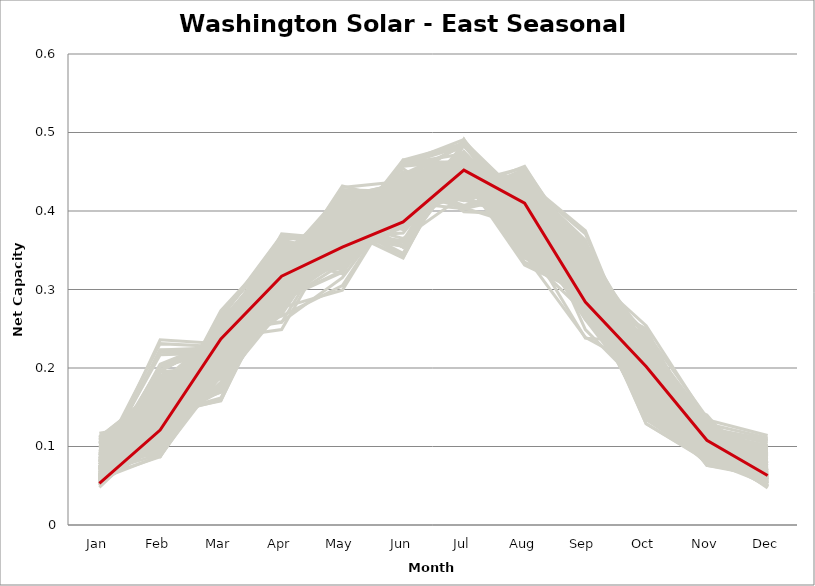
| Category | sample_001 | sample_002 | sample_003 | sample_004 | sample_005 | sample_006 | sample_007 | sample_008 | sample_009 | sample_010 | sample_011 | sample_012 | sample_013 | sample_014 | sample_015 | sample_016 | sample_017 | sample_018 | sample_019 | sample_020 | sample_021 | sample_022 | sample_023 | sample_024 | sample_025 | sample_026 | sample_027 | sample_028 | sample_029 | sample_030 | sample_031 | sample_032 | sample_033 | sample_034 | sample_035 | sample_036 | sample_037 | sample_038 | sample_039 | sample_040 | sample_041 | sample_042 | sample_043 | sample_044 | sample_045 | sample_046 | sample_047 | sample_048 | sample_049 | sample_050 | sample_051 | sample_052 | sample_053 | sample_054 | sample_055 | sample_056 | sample_057 | sample_058 | sample_059 | sample_060 | sample_061 | sample_062 | sample_063 | sample_064 | sample_065 | sample_066 | sample_067 | sample_068 | sample_069 | sample_070 | sample_071 | sample_072 | sample_073 | sample_074 | sample_075 | sample_076 | sample_077 | sample_078 | sample_079 | sample_080 | sample_081 | sample_082 | sample_083 | sample_084 | sample_085 | sample_086 | sample_087 | sample_088 | sample_089 | sample_090 | sample_091 | sample_093 | sample_094 | sample_095 | sample_096 | sample_097 | sample_098 | sample_099 | sample_100 | sample_101 | sample_102 | sample_103 | sample_104 | sample_105 | sample_106 | sample_107 | sample_108 | sample_109 | sample_110 | sample_111 | sample_112 | sample_113 | sample_114 | sample_115 | sample_116 | sample_117 | sample_118 | sample_119 | sample_120 | sample_121 | sample_122 | sample_123 | sample_124 | sample_125 | sample_126 | sample_127 | sample_128 | sample_129 | sample_130 | sample_131 | sample_132 | sample_133 | sample_134 | sample_135 | sample_136 | sample_137 | sample_138 | sample_139 | sample_140 | sample_141 | sample_142 | sample_143 | sample_144 | sample_145 | sample_146 | sample_147 | sample_148 | sample_149 | sample_150 | sample_151 | sample_152 | sample_153 | sample_154 | sample_155 | sample_156 | sample_157 | sample_158 | sample_159 | sample_160 | sample_161 | sample_162 | sample_163 | sample_164 | sample_165 | sample_166 | sample_167 | sample_168 | sample_169 | sample_170 | sample_171 | sample_172 | sample_173 | sample_174 | sample_175 | sample_176 | sample_177 | sample_178 | sample_179 | sample_180 | sample_181 | sample_182 | sample_183 | sample_184 | sample_185 | sample_186 | sample_187 | sample_188 | sample_189 | sample_190 | sample_191 | sample_192 | sample_193 | sample_194 | sample_195 | sample_196 | sample_197 | sample_198 | sample_199 | sample_200 | sample_201 | sample_202 | sample_203 | sample_204 | sample_205 | sample_206 | sample_207 | sample_208 | sample_209 | sample_210 | sample_211 | sample_212 | sample_213 | sample_214 | sample_215 | sample_216 | sample_217 | sample_218 | sample_219 | sample_220 | sample_221 | sample_222 | sample_223 | sample_224 | sample_225 | sample_226 | sample_227 | sample_228 | sample_229 | sample_230 | sample_231 | sample_232 | sample_233 | sample_234 | sample_235 | sample_236 | sample_237 | sample_238 | sample_239 | sample_240 | sample_241 | sample_242 | sample_243 | sample_244 | sample_245 | sample_246 | sample_247 | sample_248 | sample_249 | sample_250 | sample_092 |
|---|---|---|---|---|---|---|---|---|---|---|---|---|---|---|---|---|---|---|---|---|---|---|---|---|---|---|---|---|---|---|---|---|---|---|---|---|---|---|---|---|---|---|---|---|---|---|---|---|---|---|---|---|---|---|---|---|---|---|---|---|---|---|---|---|---|---|---|---|---|---|---|---|---|---|---|---|---|---|---|---|---|---|---|---|---|---|---|---|---|---|---|---|---|---|---|---|---|---|---|---|---|---|---|---|---|---|---|---|---|---|---|---|---|---|---|---|---|---|---|---|---|---|---|---|---|---|---|---|---|---|---|---|---|---|---|---|---|---|---|---|---|---|---|---|---|---|---|---|---|---|---|---|---|---|---|---|---|---|---|---|---|---|---|---|---|---|---|---|---|---|---|---|---|---|---|---|---|---|---|---|---|---|---|---|---|---|---|---|---|---|---|---|---|---|---|---|---|---|---|---|---|---|---|---|---|---|---|---|---|---|---|---|---|---|---|---|---|---|---|---|---|---|---|---|---|---|---|---|---|---|---|---|---|---|---|---|---|---|---|---|---|---|---|---|---|---|---|---|---|---|
| Jan | 0.062 | 0.07 | 0.074 | 0.117 | 0.109 | 0.089 | 0.053 | 0.085 | 0.11 | 0.053 | 0.067 | 0.056 | 0.099 | 0.08 | 0.089 | 0.057 | 0.088 | 0.113 | 0.083 | 0.061 | 0.062 | 0.054 | 0.056 | 0.087 | 0.091 | 0.061 | 0.084 | 0.11 | 0.061 | 0.066 | 0.055 | 0.084 | 0.067 | 0.078 | 0.066 | 0.057 | 0.055 | 0.061 | 0.06 | 0.096 | 0.088 | 0.106 | 0.111 | 0.071 | 0.075 | 0.055 | 0.092 | 0.088 | 0.058 | 0.068 | 0.053 | 0.056 | 0.108 | 0.11 | 0.07 | 0.099 | 0.092 | 0.063 | 0.107 | 0.082 | 0.077 | 0.061 | 0.056 | 0.057 | 0.091 | 0.072 | 0.053 | 0.073 | 0.064 | 0.111 | 0.082 | 0.089 | 0.084 | 0.064 | 0.068 | 0.071 | 0.055 | 0.107 | 0.108 | 0.053 | 0.094 | 0.098 | 0.112 | 0.093 | 0.1 | 0.109 | 0.055 | 0.113 | 0.087 | 0.085 | 0.081 | 0.06 | 0.052 | 0.108 | 0.063 | 0.089 | 0.069 | 0.112 | 0.064 | 0.05 | 0.093 | 0.059 | 0.082 | 0.083 | 0.082 | 0.055 | 0.067 | 0.064 | 0.096 | 0.08 | 0.088 | 0.088 | 0.09 | 0.105 | 0.053 | 0.082 | 0.08 | 0.092 | 0.072 | 0.064 | 0.063 | 0.081 | 0.066 | 0.055 | 0.053 | 0.104 | 0.061 | 0.088 | 0.091 | 0.093 | 0.053 | 0.093 | 0.094 | 0.082 | 0.084 | 0.054 | 0.085 | 0.054 | 0.09 | 0.062 | 0.057 | 0.089 | 0.099 | 0.097 | 0.071 | 0.091 | 0.081 | 0.074 | 0.058 | 0.06 | 0.048 | 0.072 | 0.061 | 0.098 | 0.093 | 0.08 | 0.108 | 0.089 | 0.08 | 0.061 | 0.094 | 0.102 | 0.104 | 0.099 | 0.061 | 0.103 | 0.059 | 0.059 | 0.091 | 0.062 | 0.065 | 0.063 | 0.1 | 0.062 | 0.069 | 0.077 | 0.073 | 0.065 | 0.063 | 0.052 | 0.058 | 0.066 | 0.075 | 0.07 | 0.077 | 0.095 | 0.106 | 0.086 | 0.105 | 0.085 | 0.09 | 0.059 | 0.072 | 0.074 | 0.052 | 0.077 | 0.055 | 0.061 | 0.065 | 0.053 | 0.086 | 0.098 | 0.085 | 0.071 | 0.099 | 0.079 | 0.102 | 0.098 | 0.107 | 0.107 | 0.064 | 0.087 | 0.059 | 0.084 | 0.058 | 0.08 | 0.074 | 0.058 | 0.091 | 0.084 | 0.105 | 0.059 | 0.083 | 0.103 | 0.103 | 0.078 | 0.082 | 0.107 | 0.088 | 0.098 | 0.051 | 0.052 | 0.058 | 0.08 | 0.084 | 0.09 | 0.112 | 0.052 | 0.088 | 0.09 | 0.077 | 0.077 | 0.083 | 0.067 | 0.058 | 0.087 | 0.089 | 0.071 | 0.067 | 0.053 |
| Feb | 0.119 | 0.142 | 0.171 | 0.13 | 0.174 | 0.138 | 0.116 | 0.111 | 0.128 | 0.155 | 0.15 | 0.116 | 0.118 | 0.174 | 0.096 | 0.152 | 0.132 | 0.13 | 0.097 | 0.163 | 0.111 | 0.113 | 0.155 | 0.095 | 0.087 | 0.161 | 0.122 | 0.142 | 0.158 | 0.158 | 0.109 | 0.126 | 0.09 | 0.112 | 0.131 | 0.115 | 0.137 | 0.154 | 0.149 | 0.122 | 0.133 | 0.14 | 0.117 | 0.223 | 0.168 | 0.107 | 0.098 | 0.111 | 0.186 | 0.122 | 0.116 | 0.109 | 0.139 | 0.152 | 0.202 | 0.112 | 0.109 | 0.144 | 0.132 | 0.108 | 0.133 | 0.197 | 0.124 | 0.149 | 0.149 | 0.121 | 0.15 | 0.223 | 0.205 | 0.165 | 0.121 | 0.165 | 0.134 | 0.195 | 0.12 | 0.16 | 0.186 | 0.141 | 0.122 | 0.106 | 0.094 | 0.135 | 0.128 | 0.103 | 0.143 | 0.137 | 0.176 | 0.123 | 0.107 | 0.14 | 0.12 | 0.142 | 0.128 | 0.157 | 0.147 | 0.092 | 0.18 | 0.173 | 0.122 | 0.148 | 0.151 | 0.166 | 0.141 | 0.128 | 0.128 | 0.104 | 0.127 | 0.097 | 0.116 | 0.162 | 0.096 | 0.118 | 0.097 | 0.127 | 0.114 | 0.116 | 0.127 | 0.136 | 0.122 | 0.155 | 0.14 | 0.231 | 0.134 | 0.129 | 0.14 | 0.15 | 0.126 | 0.126 | 0.12 | 0.101 | 0.182 | 0.134 | 0.087 | 0.132 | 0.13 | 0.112 | 0.11 | 0.103 | 0.117 | 0.128 | 0.148 | 0.139 | 0.108 | 0.116 | 0.094 | 0.135 | 0.108 | 0.181 | 0.088 | 0.149 | 0.122 | 0.178 | 0.164 | 0.096 | 0.148 | 0.128 | 0.141 | 0.142 | 0.151 | 0.196 | 0.124 | 0.119 | 0.162 | 0.136 | 0.152 | 0.139 | 0.157 | 0.143 | 0.106 | 0.188 | 0.12 | 0.11 | 0.141 | 0.109 | 0.191 | 0.139 | 0.16 | 0.116 | 0.126 | 0.125 | 0.113 | 0.129 | 0.118 | 0.105 | 0.123 | 0.142 | 0.131 | 0.141 | 0.139 | 0.132 | 0.128 | 0.149 | 0.105 | 0.202 | 0.136 | 0.217 | 0.147 | 0.087 | 0.102 | 0.107 | 0.144 | 0.136 | 0.14 | 0.236 | 0.146 | 0.111 | 0.135 | 0.089 | 0.125 | 0.125 | 0.129 | 0.147 | 0.112 | 0.142 | 0.159 | 0.128 | 0.132 | 0.109 | 0.155 | 0.18 | 0.181 | 0.197 | 0.14 | 0.177 | 0.148 | 0.118 | 0.137 | 0.162 | 0.153 | 0.162 | 0.169 | 0.183 | 0.156 | 0.122 | 0.127 | 0.135 | 0.172 | 0.108 | 0.107 | 0.104 | 0.115 | 0.22 | 0.139 | 0.183 | 0.105 | 0.09 | 0.134 | 0.133 | 0.161 | 0.121 |
| Mar | 0.238 | 0.265 | 0.236 | 0.225 | 0.254 | 0.193 | 0.237 | 0.229 | 0.21 | 0.189 | 0.229 | 0.236 | 0.219 | 0.241 | 0.222 | 0.247 | 0.189 | 0.247 | 0.223 | 0.212 | 0.254 | 0.238 | 0.252 | 0.201 | 0.197 | 0.223 | 0.176 | 0.214 | 0.255 | 0.233 | 0.224 | 0.218 | 0.238 | 0.213 | 0.268 | 0.234 | 0.247 | 0.253 | 0.247 | 0.25 | 0.172 | 0.228 | 0.221 | 0.222 | 0.232 | 0.232 | 0.222 | 0.238 | 0.206 | 0.259 | 0.237 | 0.245 | 0.209 | 0.251 | 0.221 | 0.248 | 0.237 | 0.206 | 0.215 | 0.206 | 0.246 | 0.236 | 0.242 | 0.205 | 0.237 | 0.191 | 0.19 | 0.226 | 0.236 | 0.249 | 0.212 | 0.239 | 0.177 | 0.203 | 0.239 | 0.235 | 0.188 | 0.229 | 0.208 | 0.218 | 0.196 | 0.221 | 0.235 | 0.228 | 0.208 | 0.216 | 0.193 | 0.237 | 0.202 | 0.207 | 0.18 | 0.243 | 0.251 | 0.244 | 0.201 | 0.212 | 0.2 | 0.251 | 0.256 | 0.194 | 0.209 | 0.228 | 0.209 | 0.173 | 0.172 | 0.227 | 0.273 | 0.246 | 0.235 | 0.209 | 0.223 | 0.243 | 0.238 | 0.237 | 0.252 | 0.204 | 0.171 | 0.206 | 0.192 | 0.238 | 0.26 | 0.227 | 0.263 | 0.245 | 0.25 | 0.238 | 0.247 | 0.211 | 0.211 | 0.225 | 0.192 | 0.213 | 0.203 | 0.176 | 0.195 | 0.242 | 0.182 | 0.229 | 0.209 | 0.271 | 0.241 | 0.159 | 0.224 | 0.217 | 0.223 | 0.173 | 0.197 | 0.23 | 0.227 | 0.252 | 0.243 | 0.232 | 0.227 | 0.194 | 0.214 | 0.223 | 0.234 | 0.169 | 0.204 | 0.237 | 0.255 | 0.214 | 0.256 | 0.215 | 0.258 | 0.217 | 0.254 | 0.248 | 0.215 | 0.209 | 0.254 | 0.251 | 0.214 | 0.222 | 0.209 | 0.187 | 0.238 | 0.25 | 0.251 | 0.251 | 0.237 | 0.268 | 0.195 | 0.253 | 0.174 | 0.217 | 0.236 | 0.171 | 0.218 | 0.188 | 0.207 | 0.209 | 0.18 | 0.233 | 0.253 | 0.219 | 0.248 | 0.236 | 0.236 | 0.236 | 0.245 | 0.211 | 0.191 | 0.231 | 0.233 | 0.197 | 0.241 | 0.19 | 0.21 | 0.232 | 0.267 | 0.198 | 0.25 | 0.158 | 0.25 | 0.214 | 0.238 | 0.238 | 0.212 | 0.23 | 0.247 | 0.235 | 0.162 | 0.247 | 0.242 | 0.19 | 0.179 | 0.249 | 0.203 | 0.207 | 0.191 | 0.187 | 0.208 | 0.176 | 0.191 | 0.171 | 0.245 | 0.226 | 0.237 | 0.237 | 0.206 | 0.221 | 0.207 | 0.21 | 0.226 | 0.213 | 0.17 | 0.267 | 0.231 | 0.237 |
| Apr | 0.338 | 0.369 | 0.339 | 0.327 | 0.354 | 0.335 | 0.313 | 0.317 | 0.335 | 0.297 | 0.316 | 0.325 | 0.343 | 0.367 | 0.317 | 0.345 | 0.287 | 0.316 | 0.328 | 0.305 | 0.333 | 0.3 | 0.342 | 0.32 | 0.308 | 0.287 | 0.309 | 0.346 | 0.343 | 0.322 | 0.326 | 0.283 | 0.249 | 0.344 | 0.356 | 0.327 | 0.326 | 0.336 | 0.277 | 0.329 | 0.308 | 0.355 | 0.336 | 0.287 | 0.335 | 0.307 | 0.327 | 0.31 | 0.311 | 0.35 | 0.295 | 0.318 | 0.33 | 0.344 | 0.291 | 0.328 | 0.314 | 0.292 | 0.345 | 0.268 | 0.29 | 0.285 | 0.322 | 0.278 | 0.331 | 0.319 | 0.295 | 0.281 | 0.288 | 0.344 | 0.329 | 0.364 | 0.304 | 0.311 | 0.352 | 0.326 | 0.304 | 0.36 | 0.331 | 0.314 | 0.324 | 0.336 | 0.326 | 0.316 | 0.328 | 0.35 | 0.29 | 0.324 | 0.344 | 0.313 | 0.275 | 0.331 | 0.326 | 0.347 | 0.287 | 0.319 | 0.31 | 0.363 | 0.35 | 0.292 | 0.348 | 0.314 | 0.295 | 0.292 | 0.294 | 0.302 | 0.357 | 0.258 | 0.325 | 0.316 | 0.321 | 0.322 | 0.313 | 0.323 | 0.339 | 0.27 | 0.291 | 0.294 | 0.333 | 0.322 | 0.348 | 0.29 | 0.368 | 0.319 | 0.34 | 0.361 | 0.35 | 0.328 | 0.338 | 0.322 | 0.299 | 0.357 | 0.311 | 0.304 | 0.341 | 0.309 | 0.329 | 0.302 | 0.325 | 0.351 | 0.266 | 0.314 | 0.32 | 0.343 | 0.272 | 0.322 | 0.334 | 0.366 | 0.295 | 0.331 | 0.318 | 0.35 | 0.287 | 0.319 | 0.353 | 0.334 | 0.355 | 0.33 | 0.342 | 0.28 | 0.325 | 0.346 | 0.347 | 0.322 | 0.341 | 0.318 | 0.33 | 0.335 | 0.318 | 0.305 | 0.351 | 0.331 | 0.326 | 0.307 | 0.313 | 0.334 | 0.341 | 0.345 | 0.353 | 0.317 | 0.333 | 0.359 | 0.33 | 0.332 | 0.287 | 0.317 | 0.319 | 0.312 | 0.335 | 0.282 | 0.301 | 0.302 | 0.322 | 0.292 | 0.322 | 0.289 | 0.341 | 0.294 | 0.315 | 0.336 | 0.302 | 0.323 | 0.334 | 0.295 | 0.354 | 0.325 | 0.318 | 0.319 | 0.332 | 0.328 | 0.358 | 0.32 | 0.33 | 0.324 | 0.259 | 0.282 | 0.288 | 0.3 | 0.322 | 0.371 | 0.36 | 0.283 | 0.315 | 0.345 | 0.352 | 0.323 | 0.335 | 0.335 | 0.327 | 0.353 | 0.285 | 0.302 | 0.28 | 0.29 | 0.289 | 0.301 | 0.353 | 0.328 | 0.318 | 0.312 | 0.338 | 0.293 | 0.309 | 0.314 | 0.302 | 0.318 | 0.31 | 0.355 | 0.321 | 0.317 |
| May | 0.358 | 0.354 | 0.37 | 0.419 | 0.355 | 0.371 | 0.346 | 0.418 | 0.368 | 0.345 | 0.392 | 0.348 | 0.412 | 0.366 | 0.407 | 0.329 | 0.404 | 0.43 | 0.397 | 0.383 | 0.358 | 0.361 | 0.32 | 0.38 | 0.383 | 0.324 | 0.375 | 0.347 | 0.328 | 0.39 | 0.375 | 0.386 | 0.383 | 0.373 | 0.359 | 0.355 | 0.333 | 0.332 | 0.299 | 0.413 | 0.371 | 0.353 | 0.423 | 0.381 | 0.384 | 0.362 | 0.404 | 0.427 | 0.339 | 0.359 | 0.367 | 0.363 | 0.373 | 0.353 | 0.358 | 0.417 | 0.432 | 0.406 | 0.365 | 0.385 | 0.4 | 0.34 | 0.354 | 0.408 | 0.375 | 0.369 | 0.335 | 0.378 | 0.342 | 0.348 | 0.407 | 0.368 | 0.375 | 0.354 | 0.357 | 0.391 | 0.335 | 0.352 | 0.375 | 0.378 | 0.393 | 0.369 | 0.408 | 0.422 | 0.367 | 0.359 | 0.347 | 0.422 | 0.378 | 0.38 | 0.373 | 0.34 | 0.34 | 0.355 | 0.396 | 0.397 | 0.36 | 0.346 | 0.353 | 0.337 | 0.37 | 0.39 | 0.383 | 0.366 | 0.369 | 0.368 | 0.36 | 0.385 | 0.415 | 0.386 | 0.408 | 0.408 | 0.424 | 0.419 | 0.353 | 0.381 | 0.366 | 0.399 | 0.37 | 0.385 | 0.35 | 0.38 | 0.351 | 0.356 | 0.325 | 0.338 | 0.349 | 0.402 | 0.397 | 0.397 | 0.344 | 0.365 | 0.388 | 0.37 | 0.377 | 0.357 | 0.38 | 0.371 | 0.393 | 0.358 | 0.305 | 0.369 | 0.42 | 0.409 | 0.388 | 0.372 | 0.375 | 0.371 | 0.379 | 0.338 | 0.341 | 0.37 | 0.322 | 0.396 | 0.371 | 0.358 | 0.339 | 0.372 | 0.37 | 0.352 | 0.415 | 0.405 | 0.339 | 0.38 | 0.32 | 0.384 | 0.33 | 0.342 | 0.401 | 0.351 | 0.358 | 0.361 | 0.38 | 0.358 | 0.366 | 0.359 | 0.372 | 0.355 | 0.35 | 0.345 | 0.358 | 0.357 | 0.374 | 0.406 | 0.373 | 0.383 | 0.413 | 0.369 | 0.358 | 0.404 | 0.396 | 0.394 | 0.38 | 0.367 | 0.343 | 0.369 | 0.33 | 0.377 | 0.385 | 0.358 | 0.401 | 0.382 | 0.373 | 0.375 | 0.34 | 0.369 | 0.407 | 0.385 | 0.369 | 0.418 | 0.348 | 0.386 | 0.359 | 0.366 | 0.315 | 0.392 | 0.402 | 0.373 | 0.379 | 0.364 | 0.345 | 0.333 | 0.366 | 0.341 | 0.343 | 0.367 | 0.356 | 0.351 | 0.393 | 0.364 | 0.352 | 0.336 | 0.396 | 0.366 | 0.398 | 0.371 | 0.352 | 0.364 | 0.419 | 0.423 | 0.371 | 0.382 | 0.378 | 0.371 | 0.372 | 0.394 | 0.362 | 0.359 | 0.387 | 0.354 |
| Jun | 0.416 | 0.433 | 0.44 | 0.431 | 0.413 | 0.418 | 0.387 | 0.426 | 0.386 | 0.442 | 0.41 | 0.379 | 0.406 | 0.44 | 0.416 | 0.429 | 0.354 | 0.438 | 0.425 | 0.431 | 0.426 | 0.38 | 0.449 | 0.442 | 0.433 | 0.417 | 0.422 | 0.425 | 0.44 | 0.425 | 0.394 | 0.389 | 0.411 | 0.405 | 0.424 | 0.385 | 0.425 | 0.437 | 0.425 | 0.429 | 0.416 | 0.429 | 0.413 | 0.425 | 0.439 | 0.392 | 0.412 | 0.425 | 0.46 | 0.426 | 0.372 | 0.387 | 0.412 | 0.415 | 0.424 | 0.43 | 0.412 | 0.415 | 0.41 | 0.365 | 0.401 | 0.437 | 0.399 | 0.398 | 0.36 | 0.395 | 0.433 | 0.42 | 0.429 | 0.418 | 0.408 | 0.379 | 0.417 | 0.463 | 0.424 | 0.418 | 0.461 | 0.419 | 0.388 | 0.396 | 0.436 | 0.402 | 0.425 | 0.416 | 0.415 | 0.413 | 0.461 | 0.429 | 0.383 | 0.395 | 0.4 | 0.416 | 0.409 | 0.419 | 0.401 | 0.426 | 0.46 | 0.423 | 0.43 | 0.441 | 0.414 | 0.435 | 0.392 | 0.413 | 0.418 | 0.355 | 0.43 | 0.408 | 0.421 | 0.346 | 0.415 | 0.435 | 0.42 | 0.435 | 0.427 | 0.379 | 0.422 | 0.38 | 0.393 | 0.419 | 0.431 | 0.426 | 0.436 | 0.388 | 0.431 | 0.437 | 0.434 | 0.403 | 0.403 | 0.41 | 0.459 | 0.408 | 0.429 | 0.423 | 0.416 | 0.388 | 0.413 | 0.394 | 0.382 | 0.435 | 0.422 | 0.41 | 0.414 | 0.412 | 0.454 | 0.407 | 0.39 | 0.443 | 0.341 | 0.436 | 0.401 | 0.446 | 0.415 | 0.432 | 0.41 | 0.446 | 0.432 | 0.423 | 0.45 | 0.431 | 0.427 | 0.413 | 0.432 | 0.405 | 0.447 | 0.401 | 0.433 | 0.422 | 0.421 | 0.457 | 0.427 | 0.42 | 0.388 | 0.398 | 0.465 | 0.434 | 0.437 | 0.423 | 0.435 | 0.406 | 0.42 | 0.437 | 0.384 | 0.42 | 0.404 | 0.394 | 0.43 | 0.421 | 0.428 | 0.376 | 0.356 | 0.421 | 0.387 | 0.425 | 0.408 | 0.427 | 0.433 | 0.34 | 0.426 | 0.424 | 0.398 | 0.401 | 0.426 | 0.436 | 0.425 | 0.387 | 0.433 | 0.43 | 0.386 | 0.436 | 0.436 | 0.343 | 0.428 | 0.417 | 0.418 | 0.39 | 0.394 | 0.362 | 0.356 | 0.446 | 0.424 | 0.439 | 0.418 | 0.423 | 0.429 | 0.389 | 0.427 | 0.431 | 0.354 | 0.415 | 0.447 | 0.465 | 0.417 | 0.415 | 0.354 | 0.407 | 0.415 | 0.404 | 0.423 | 0.423 | 0.401 | 0.424 | 0.392 | 0.461 | 0.355 | 0.427 | 0.398 | 0.429 | 0.413 | 0.386 |
| Jul | 0.451 | 0.443 | 0.46 | 0.446 | 0.468 | 0.424 | 0.461 | 0.434 | 0.452 | 0.485 | 0.461 | 0.444 | 0.447 | 0.457 | 0.419 | 0.455 | 0.457 | 0.432 | 0.436 | 0.453 | 0.45 | 0.46 | 0.457 | 0.418 | 0.419 | 0.451 | 0.432 | 0.45 | 0.452 | 0.462 | 0.455 | 0.438 | 0.403 | 0.467 | 0.451 | 0.454 | 0.458 | 0.452 | 0.44 | 0.424 | 0.43 | 0.442 | 0.447 | 0.455 | 0.459 | 0.461 | 0.427 | 0.436 | 0.473 | 0.453 | 0.465 | 0.459 | 0.445 | 0.46 | 0.45 | 0.424 | 0.433 | 0.45 | 0.452 | 0.42 | 0.419 | 0.458 | 0.451 | 0.451 | 0.462 | 0.485 | 0.489 | 0.459 | 0.463 | 0.462 | 0.458 | 0.457 | 0.439 | 0.462 | 0.456 | 0.466 | 0.491 | 0.444 | 0.452 | 0.452 | 0.407 | 0.449 | 0.451 | 0.43 | 0.45 | 0.447 | 0.485 | 0.446 | 0.471 | 0.454 | 0.427 | 0.461 | 0.463 | 0.457 | 0.452 | 0.423 | 0.459 | 0.467 | 0.457 | 0.485 | 0.459 | 0.45 | 0.449 | 0.42 | 0.42 | 0.488 | 0.443 | 0.422 | 0.428 | 0.491 | 0.43 | 0.436 | 0.432 | 0.452 | 0.452 | 0.431 | 0.418 | 0.434 | 0.471 | 0.463 | 0.459 | 0.454 | 0.442 | 0.456 | 0.457 | 0.456 | 0.456 | 0.467 | 0.463 | 0.426 | 0.483 | 0.456 | 0.413 | 0.428 | 0.458 | 0.458 | 0.436 | 0.445 | 0.453 | 0.449 | 0.446 | 0.447 | 0.43 | 0.457 | 0.399 | 0.434 | 0.467 | 0.462 | 0.486 | 0.456 | 0.46 | 0.453 | 0.446 | 0.416 | 0.447 | 0.418 | 0.44 | 0.437 | 0.436 | 0.449 | 0.425 | 0.446 | 0.467 | 0.45 | 0.455 | 0.443 | 0.457 | 0.458 | 0.421 | 0.464 | 0.456 | 0.451 | 0.444 | 0.444 | 0.447 | 0.447 | 0.462 | 0.448 | 0.462 | 0.458 | 0.447 | 0.445 | 0.474 | 0.414 | 0.435 | 0.45 | 0.458 | 0.44 | 0.45 | 0.448 | 0.462 | 0.449 | 0.439 | 0.453 | 0.466 | 0.452 | 0.456 | 0.485 | 0.404 | 0.456 | 0.425 | 0.447 | 0.439 | 0.454 | 0.446 | 0.473 | 0.458 | 0.405 | 0.452 | 0.453 | 0.452 | 0.475 | 0.45 | 0.441 | 0.447 | 0.445 | 0.427 | 0.486 | 0.468 | 0.464 | 0.467 | 0.465 | 0.437 | 0.473 | 0.454 | 0.476 | 0.44 | 0.463 | 0.491 | 0.441 | 0.483 | 0.486 | 0.454 | 0.421 | 0.455 | 0.43 | 0.466 | 0.452 | 0.439 | 0.438 | 0.466 | 0.459 | 0.455 | 0.452 | 0.484 | 0.42 | 0.418 | 0.446 | 0.462 | 0.452 |
| Aug | 0.44 | 0.342 | 0.414 | 0.361 | 0.361 | 0.423 | 0.414 | 0.421 | 0.39 | 0.402 | 0.418 | 0.407 | 0.378 | 0.4 | 0.426 | 0.383 | 0.376 | 0.362 | 0.419 | 0.421 | 0.354 | 0.416 | 0.386 | 0.429 | 0.436 | 0.435 | 0.446 | 0.38 | 0.381 | 0.415 | 0.364 | 0.426 | 0.42 | 0.398 | 0.345 | 0.408 | 0.397 | 0.383 | 0.441 | 0.403 | 0.441 | 0.379 | 0.376 | 0.406 | 0.42 | 0.422 | 0.422 | 0.415 | 0.403 | 0.332 | 0.422 | 0.411 | 0.415 | 0.365 | 0.418 | 0.41 | 0.418 | 0.43 | 0.387 | 0.437 | 0.42 | 0.422 | 0.4 | 0.434 | 0.366 | 0.402 | 0.414 | 0.405 | 0.425 | 0.361 | 0.383 | 0.344 | 0.443 | 0.406 | 0.347 | 0.414 | 0.396 | 0.374 | 0.388 | 0.372 | 0.429 | 0.385 | 0.359 | 0.419 | 0.421 | 0.373 | 0.396 | 0.361 | 0.396 | 0.425 | 0.457 | 0.398 | 0.395 | 0.366 | 0.43 | 0.427 | 0.412 | 0.351 | 0.347 | 0.406 | 0.387 | 0.416 | 0.43 | 0.45 | 0.452 | 0.412 | 0.331 | 0.415 | 0.411 | 0.36 | 0.423 | 0.401 | 0.419 | 0.355 | 0.346 | 0.439 | 0.449 | 0.423 | 0.403 | 0.412 | 0.348 | 0.403 | 0.354 | 0.393 | 0.384 | 0.376 | 0.342 | 0.377 | 0.386 | 0.418 | 0.394 | 0.373 | 0.435 | 0.443 | 0.406 | 0.419 | 0.421 | 0.371 | 0.385 | 0.344 | 0.442 | 0.439 | 0.417 | 0.38 | 0.396 | 0.431 | 0.401 | 0.407 | 0.412 | 0.389 | 0.418 | 0.405 | 0.439 | 0.433 | 0.384 | 0.389 | 0.372 | 0.43 | 0.42 | 0.436 | 0.408 | 0.375 | 0.367 | 0.417 | 0.389 | 0.419 | 0.391 | 0.381 | 0.427 | 0.408 | 0.34 | 0.35 | 0.4 | 0.383 | 0.412 | 0.429 | 0.401 | 0.343 | 0.351 | 0.391 | 0.357 | 0.341 | 0.398 | 0.391 | 0.455 | 0.417 | 0.351 | 0.437 | 0.42 | 0.389 | 0.358 | 0.429 | 0.421 | 0.419 | 0.394 | 0.411 | 0.385 | 0.412 | 0.38 | 0.351 | 0.415 | 0.421 | 0.422 | 0.402 | 0.371 | 0.401 | 0.364 | 0.43 | 0.381 | 0.361 | 0.335 | 0.349 | 0.351 | 0.437 | 0.442 | 0.437 | 0.419 | 0.407 | 0.345 | 0.395 | 0.359 | 0.43 | 0.44 | 0.365 | 0.37 | 0.396 | 0.428 | 0.369 | 0.348 | 0.392 | 0.396 | 0.401 | 0.432 | 0.453 | 0.38 | 0.44 | 0.366 | 0.351 | 0.413 | 0.412 | 0.397 | 0.409 | 0.426 | 0.41 | 0.411 | 0.427 | 0.432 | 0.348 | 0.415 | 0.41 |
| Sep | 0.284 | 0.287 | 0.3 | 0.302 | 0.295 | 0.273 | 0.272 | 0.318 | 0.357 | 0.331 | 0.327 | 0.275 | 0.312 | 0.282 | 0.336 | 0.269 | 0.322 | 0.315 | 0.334 | 0.32 | 0.313 | 0.278 | 0.262 | 0.36 | 0.356 | 0.348 | 0.319 | 0.341 | 0.266 | 0.32 | 0.313 | 0.36 | 0.356 | 0.315 | 0.3 | 0.277 | 0.278 | 0.268 | 0.348 | 0.284 | 0.311 | 0.341 | 0.304 | 0.284 | 0.314 | 0.282 | 0.335 | 0.299 | 0.302 | 0.294 | 0.276 | 0.268 | 0.304 | 0.306 | 0.304 | 0.295 | 0.299 | 0.329 | 0.35 | 0.371 | 0.31 | 0.307 | 0.292 | 0.329 | 0.238 | 0.32 | 0.334 | 0.293 | 0.31 | 0.3 | 0.319 | 0.239 | 0.322 | 0.286 | 0.3 | 0.314 | 0.308 | 0.343 | 0.355 | 0.318 | 0.353 | 0.359 | 0.311 | 0.315 | 0.306 | 0.345 | 0.313 | 0.308 | 0.324 | 0.333 | 0.336 | 0.28 | 0.299 | 0.319 | 0.331 | 0.348 | 0.301 | 0.285 | 0.302 | 0.332 | 0.287 | 0.317 | 0.354 | 0.334 | 0.333 | 0.295 | 0.294 | 0.349 | 0.297 | 0.278 | 0.341 | 0.297 | 0.308 | 0.308 | 0.306 | 0.375 | 0.334 | 0.359 | 0.317 | 0.316 | 0.296 | 0.287 | 0.278 | 0.294 | 0.273 | 0.341 | 0.305 | 0.321 | 0.33 | 0.334 | 0.311 | 0.297 | 0.355 | 0.322 | 0.304 | 0.279 | 0.324 | 0.306 | 0.327 | 0.298 | 0.346 | 0.31 | 0.313 | 0.316 | 0.354 | 0.309 | 0.324 | 0.286 | 0.283 | 0.269 | 0.29 | 0.306 | 0.346 | 0.355 | 0.282 | 0.291 | 0.349 | 0.304 | 0.249 | 0.3 | 0.277 | 0.319 | 0.311 | 0.316 | 0.277 | 0.316 | 0.266 | 0.262 | 0.34 | 0.294 | 0.306 | 0.313 | 0.311 | 0.294 | 0.286 | 0.301 | 0.301 | 0.307 | 0.3 | 0.293 | 0.314 | 0.291 | 0.323 | 0.308 | 0.343 | 0.315 | 0.296 | 0.313 | 0.302 | 0.337 | 0.31 | 0.329 | 0.324 | 0.294 | 0.291 | 0.293 | 0.272 | 0.285 | 0.306 | 0.32 | 0.312 | 0.315 | 0.275 | 0.273 | 0.345 | 0.324 | 0.312 | 0.359 | 0.358 | 0.3 | 0.299 | 0.289 | 0.307 | 0.313 | 0.347 | 0.363 | 0.314 | 0.273 | 0.27 | 0.275 | 0.287 | 0.312 | 0.319 | 0.301 | 0.327 | 0.326 | 0.289 | 0.31 | 0.282 | 0.283 | 0.323 | 0.312 | 0.346 | 0.343 | 0.327 | 0.31 | 0.297 | 0.32 | 0.309 | 0.305 | 0.314 | 0.295 | 0.349 | 0.285 | 0.281 | 0.348 | 0.309 | 0.296 | 0.315 | 0.284 |
| Oct | 0.192 | 0.15 | 0.194 | 0.154 | 0.177 | 0.166 | 0.211 | 0.177 | 0.21 | 0.181 | 0.22 | 0.196 | 0.155 | 0.198 | 0.166 | 0.176 | 0.213 | 0.141 | 0.173 | 0.227 | 0.199 | 0.217 | 0.161 | 0.173 | 0.176 | 0.192 | 0.179 | 0.201 | 0.165 | 0.219 | 0.212 | 0.172 | 0.227 | 0.184 | 0.164 | 0.194 | 0.187 | 0.166 | 0.208 | 0.173 | 0.176 | 0.197 | 0.148 | 0.142 | 0.197 | 0.214 | 0.166 | 0.183 | 0.156 | 0.175 | 0.216 | 0.211 | 0.138 | 0.185 | 0.165 | 0.179 | 0.175 | 0.232 | 0.211 | 0.19 | 0.175 | 0.182 | 0.194 | 0.243 | 0.233 | 0.205 | 0.183 | 0.158 | 0.176 | 0.172 | 0.168 | 0.197 | 0.172 | 0.139 | 0.178 | 0.21 | 0.149 | 0.192 | 0.214 | 0.217 | 0.165 | 0.218 | 0.148 | 0.186 | 0.129 | 0.201 | 0.156 | 0.143 | 0.187 | 0.148 | 0.17 | 0.183 | 0.183 | 0.178 | 0.24 | 0.172 | 0.14 | 0.173 | 0.187 | 0.194 | 0.25 | 0.219 | 0.158 | 0.171 | 0.18 | 0.232 | 0.165 | 0.218 | 0.165 | 0.23 | 0.174 | 0.181 | 0.183 | 0.153 | 0.199 | 0.186 | 0.172 | 0.155 | 0.201 | 0.216 | 0.167 | 0.146 | 0.155 | 0.18 | 0.179 | 0.184 | 0.195 | 0.171 | 0.167 | 0.164 | 0.159 | 0.249 | 0.173 | 0.173 | 0.237 | 0.209 | 0.245 | 0.228 | 0.16 | 0.173 | 0.2 | 0.183 | 0.173 | 0.163 | 0.2 | 0.158 | 0.195 | 0.187 | 0.236 | 0.178 | 0.201 | 0.205 | 0.194 | 0.159 | 0.242 | 0.203 | 0.199 | 0.162 | 0.171 | 0.186 | 0.179 | 0.161 | 0.185 | 0.141 | 0.164 | 0.144 | 0.171 | 0.173 | 0.158 | 0.153 | 0.19 | 0.197 | 0.145 | 0.234 | 0.138 | 0.171 | 0.202 | 0.184 | 0.185 | 0.186 | 0.19 | 0.168 | 0.207 | 0.156 | 0.181 | 0.143 | 0.154 | 0.172 | 0.129 | 0.213 | 0.221 | 0.231 | 0.254 | 0.176 | 0.181 | 0.145 | 0.186 | 0.236 | 0.187 | 0.207 | 0.166 | 0.134 | 0.172 | 0.154 | 0.195 | 0.189 | 0.157 | 0.167 | 0.221 | 0.164 | 0.171 | 0.215 | 0.201 | 0.165 | 0.195 | 0.175 | 0.174 | 0.216 | 0.229 | 0.179 | 0.184 | 0.186 | 0.168 | 0.179 | 0.182 | 0.211 | 0.169 | 0.179 | 0.22 | 0.229 | 0.16 | 0.153 | 0.238 | 0.174 | 0.219 | 0.177 | 0.171 | 0.211 | 0.181 | 0.181 | 0.19 | 0.148 | 0.152 | 0.143 | 0.237 | 0.178 | 0.169 | 0.155 | 0.21 | 0.202 |
| Nov | 0.094 | 0.102 | 0.082 | 0.101 | 0.091 | 0.108 | 0.105 | 0.104 | 0.105 | 0.108 | 0.091 | 0.103 | 0.102 | 0.084 | 0.11 | 0.086 | 0.127 | 0.104 | 0.114 | 0.102 | 0.126 | 0.103 | 0.091 | 0.131 | 0.138 | 0.105 | 0.118 | 0.095 | 0.09 | 0.087 | 0.127 | 0.082 | 0.1 | 0.106 | 0.108 | 0.105 | 0.093 | 0.089 | 0.102 | 0.076 | 0.119 | 0.091 | 0.099 | 0.1 | 0.085 | 0.106 | 0.111 | 0.097 | 0.088 | 0.116 | 0.103 | 0.101 | 0.082 | 0.094 | 0.104 | 0.078 | 0.092 | 0.113 | 0.095 | 0.081 | 0.089 | 0.102 | 0.103 | 0.12 | 0.104 | 0.11 | 0.113 | 0.102 | 0.1 | 0.092 | 0.112 | 0.102 | 0.113 | 0.087 | 0.117 | 0.086 | 0.089 | 0.09 | 0.107 | 0.132 | 0.121 | 0.107 | 0.1 | 0.107 | 0.082 | 0.097 | 0.096 | 0.099 | 0.111 | 0.085 | 0.134 | 0.091 | 0.101 | 0.097 | 0.121 | 0.12 | 0.091 | 0.091 | 0.117 | 0.107 | 0.099 | 0.093 | 0.079 | 0.124 | 0.123 | 0.108 | 0.109 | 0.096 | 0.087 | 0.111 | 0.113 | 0.085 | 0.102 | 0.104 | 0.122 | 0.079 | 0.123 | 0.078 | 0.113 | 0.087 | 0.115 | 0.104 | 0.097 | 0.101 | 0.086 | 0.089 | 0.121 | 0.113 | 0.105 | 0.108 | 0.096 | 0.1 | 0.14 | 0.118 | 0.121 | 0.106 | 0.137 | 0.133 | 0.105 | 0.106 | 0.102 | 0.116 | 0.102 | 0.103 | 0.117 | 0.115 | 0.117 | 0.082 | 0.109 | 0.091 | 0.107 | 0.085 | 0.101 | 0.12 | 0.095 | 0.111 | 0.084 | 0.112 | 0.108 | 0.102 | 0.076 | 0.107 | 0.092 | 0.082 | 0.086 | 0.081 | 0.087 | 0.092 | 0.114 | 0.091 | 0.123 | 0.125 | 0.081 | 0.134 | 0.085 | 0.113 | 0.085 | 0.12 | 0.116 | 0.102 | 0.127 | 0.107 | 0.11 | 0.113 | 0.129 | 0.079 | 0.102 | 0.116 | 0.083 | 0.128 | 0.12 | 0.115 | 0.134 | 0.099 | 0.099 | 0.106 | 0.088 | 0.106 | 0.115 | 0.131 | 0.087 | 0.084 | 0.113 | 0.102 | 0.091 | 0.117 | 0.098 | 0.135 | 0.111 | 0.101 | 0.112 | 0.118 | 0.128 | 0.116 | 0.098 | 0.086 | 0.097 | 0.103 | 0.11 | 0.086 | 0.093 | 0.103 | 0.118 | 0.089 | 0.091 | 0.113 | 0.115 | 0.09 | 0.115 | 0.093 | 0.103 | 0.095 | 0.119 | 0.121 | 0.126 | 0.117 | 0.091 | 0.132 | 0.098 | 0.099 | 0.115 | 0.102 | 0.083 | 0.083 | 0.112 | 0.121 | 0.115 | 0.105 | 0.085 | 0.108 |
| Dec | 0.056 | 0.068 | 0.06 | 0.084 | 0.053 | 0.094 | 0.058 | 0.053 | 0.072 | 0.061 | 0.067 | 0.064 | 0.087 | 0.058 | 0.057 | 0.066 | 0.091 | 0.075 | 0.049 | 0.064 | 0.061 | 0.059 | 0.067 | 0.049 | 0.048 | 0.082 | 0.101 | 0.068 | 0.068 | 0.06 | 0.075 | 0.061 | 0.078 | 0.083 | 0.065 | 0.066 | 0.066 | 0.069 | 0.088 | 0.061 | 0.099 | 0.064 | 0.089 | 0.069 | 0.062 | 0.058 | 0.055 | 0.057 | 0.057 | 0.061 | 0.064 | 0.058 | 0.081 | 0.056 | 0.071 | 0.059 | 0.061 | 0.067 | 0.066 | 0.068 | 0.059 | 0.064 | 0.062 | 0.065 | 0.081 | 0.088 | 0.069 | 0.068 | 0.063 | 0.063 | 0.083 | 0.084 | 0.098 | 0.063 | 0.066 | 0.065 | 0.064 | 0.063 | 0.073 | 0.078 | 0.054 | 0.062 | 0.08 | 0.053 | 0.076 | 0.068 | 0.06 | 0.08 | 0.094 | 0.065 | 0.114 | 0.073 | 0.061 | 0.059 | 0.069 | 0.051 | 0.062 | 0.049 | 0.06 | 0.062 | 0.049 | 0.062 | 0.067 | 0.108 | 0.108 | 0.056 | 0.062 | 0.071 | 0.065 | 0.079 | 0.053 | 0.054 | 0.055 | 0.075 | 0.066 | 0.065 | 0.104 | 0.067 | 0.085 | 0.059 | 0.06 | 0.069 | 0.068 | 0.073 | 0.065 | 0.056 | 0.058 | 0.086 | 0.09 | 0.055 | 0.058 | 0.047 | 0.05 | 0.1 | 0.053 | 0.055 | 0.053 | 0.076 | 0.097 | 0.059 | 0.09 | 0.1 | 0.061 | 0.087 | 0.055 | 0.098 | 0.089 | 0.065 | 0.065 | 0.065 | 0.054 | 0.057 | 0.08 | 0.058 | 0.05 | 0.068 | 0.057 | 0.1 | 0.082 | 0.061 | 0.064 | 0.086 | 0.049 | 0.07 | 0.064 | 0.069 | 0.067 | 0.067 | 0.058 | 0.051 | 0.058 | 0.063 | 0.068 | 0.079 | 0.057 | 0.091 | 0.058 | 0.063 | 0.057 | 0.063 | 0.071 | 0.064 | 0.091 | 0.063 | 0.111 | 0.066 | 0.076 | 0.098 | 0.067 | 0.089 | 0.088 | 0.054 | 0.062 | 0.068 | 0.064 | 0.073 | 0.064 | 0.064 | 0.06 | 0.067 | 0.061 | 0.072 | 0.089 | 0.058 | 0.054 | 0.095 | 0.073 | 0.059 | 0.07 | 0.075 | 0.062 | 0.083 | 0.06 | 0.101 | 0.096 | 0.063 | 0.064 | 0.06 | 0.079 | 0.068 | 0.05 | 0.061 | 0.098 | 0.051 | 0.054 | 0.093 | 0.093 | 0.06 | 0.078 | 0.058 | 0.062 | 0.064 | 0.057 | 0.11 | 0.087 | 0.107 | 0.056 | 0.069 | 0.053 | 0.053 | 0.088 | 0.071 | 0.06 | 0.052 | 0.059 | 0.05 | 0.099 | 0.069 | 0.066 | 0.063 |